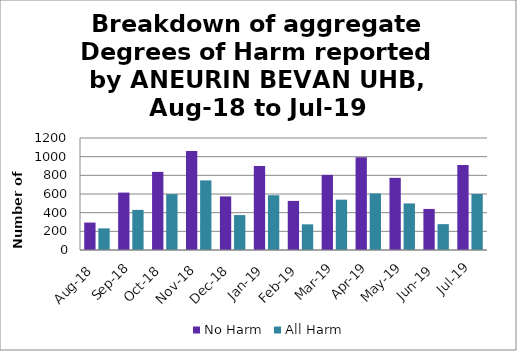
| Category | No Harm | All Harm |
|---|---|---|
| Aug-18 | 294 | 232 |
| Sep-18 | 615 | 430 |
| Oct-18 | 837 | 599 |
| Nov-18 | 1062 | 746 |
| Dec-18 | 574 | 374 |
| Jan-19 | 899 | 587 |
| Feb-19 | 526 | 275 |
| Mar-19 | 805 | 539 |
| Apr-19 | 994 | 606 |
| May-19 | 773 | 499 |
| Jun-19 | 440 | 277 |
| Jul-19 | 912 | 600 |